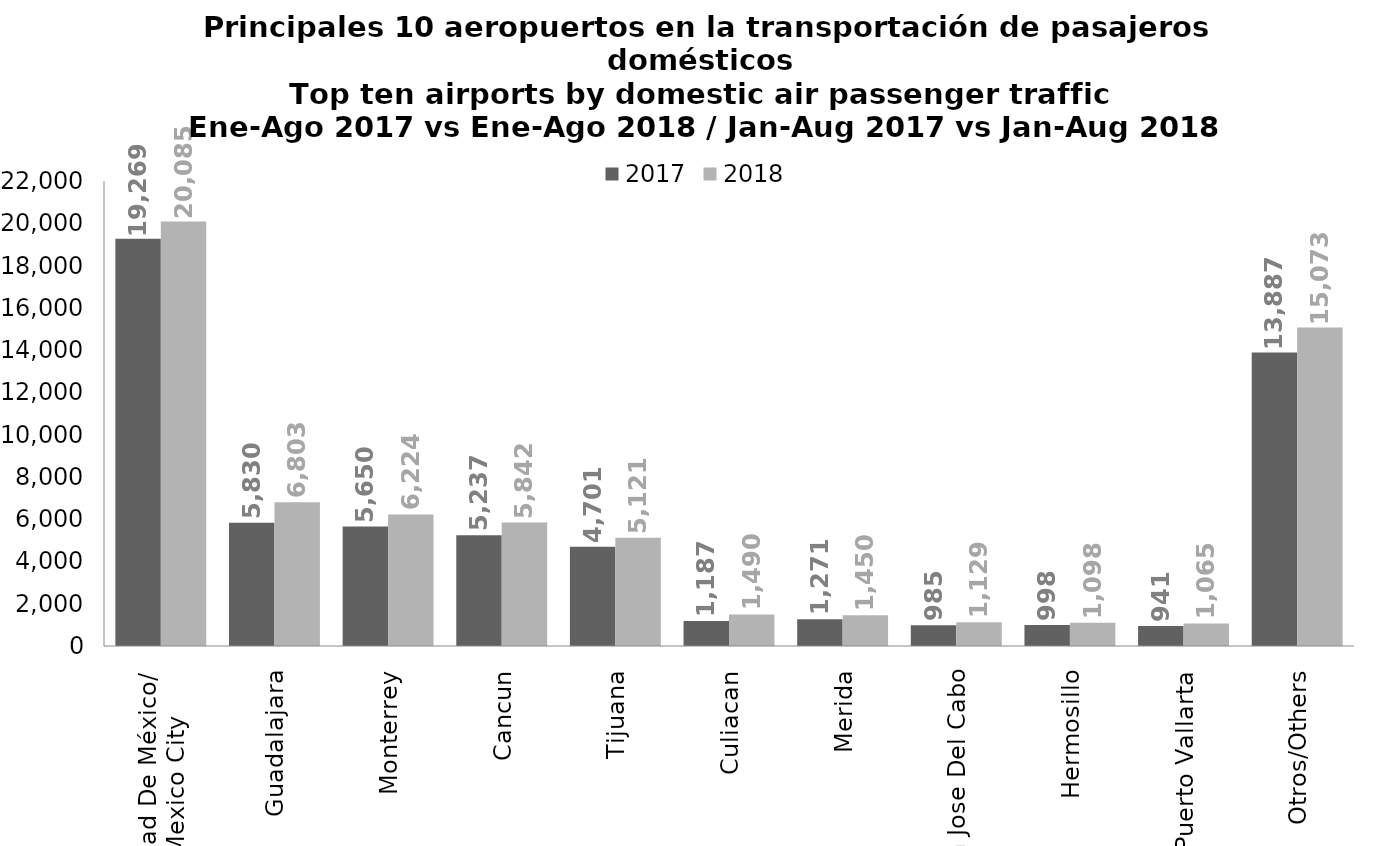
| Category | 2017 | 2018 |
|---|---|---|
| Ciudad De México/
Mexico City | 19268.687 | 20085.392 |
| Guadalajara | 5830.139 | 6802.769 |
| Monterrey | 5649.507 | 6224.039 |
| Cancun | 5236.547 | 5842.459 |
| Tijuana | 4701.035 | 5120.923 |
| Culiacan | 1187.08 | 1490.444 |
| Merida | 1270.989 | 1450.23 |
| San Jose Del Cabo | 985.355 | 1128.94 |
| Hermosillo | 998.288 | 1097.67 |
| Puerto Vallarta | 941.402 | 1064.752 |
| Otros/Others | 13887.218 | 15073.349 |